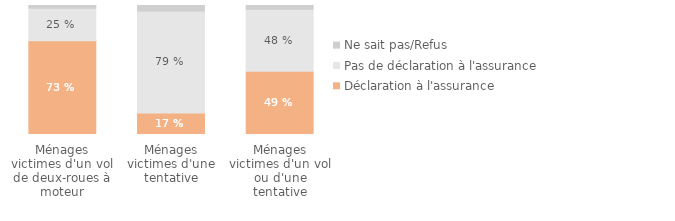
| Category | Déclaration à l'assurance | Pas de déclaration à l'assurance | Ne sait pas/Refus |
|---|---|---|---|
| Ménages victimes d'un vol ou d'une tentative | 0.49 | 0.48 | 0.03 |
| Ménages victimes d'une tentative | 0.167 | 0.791 | 0.042 |
| Ménages victimes d'un vol de deux-roues à moteur | 0.727 | 0.252 | 0.021 |